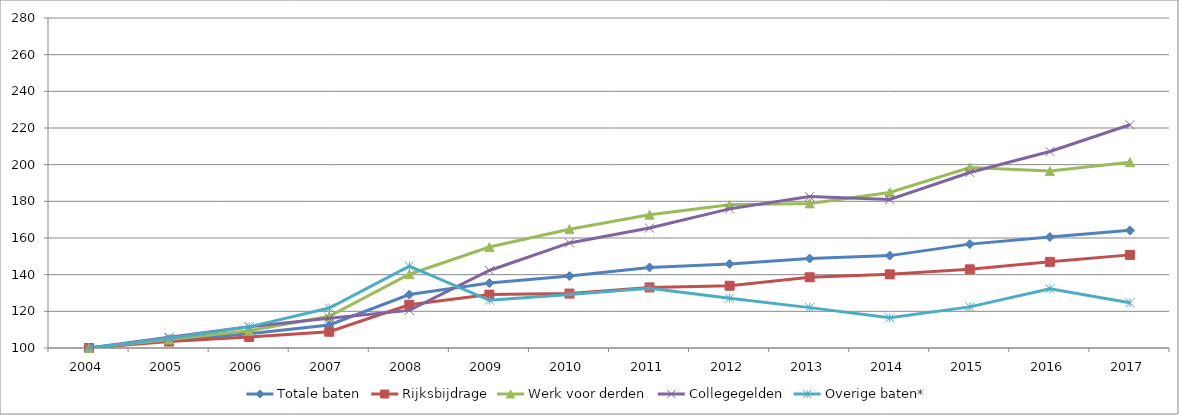
| Category | Totale baten | Rijksbijdrage | Werk voor derden | Collegegelden | Overige baten* |
|---|---|---|---|---|---|
| 2004.0 | 100 | 100 | 100 | 100 | 100 |
| 2005.0 | 104.092 | 103.499 | 104.629 | 105.881 | 105.274 |
| 2006.0 | 107.725 | 106.046 | 109.4 | 111.65 | 111.532 |
| 2007.0 | 112.54 | 108.881 | 117.297 | 116.238 | 121.792 |
| 2008.0 | 129.159 | 123.607 | 140.241 | 120.507 | 144.7 |
| 2009.0 | 135.394 | 129.117 | 155.052 | 142.268 | 126.04 |
| 2010.0 | 139.236 | 129.673 | 164.812 | 157.305 | 129.194 |
| 2011.0 | 143.936 | 133.048 | 172.718 | 165.412 | 132.613 |
| 2012.0 | 145.837 | 133.95 | 178.088 | 175.878 | 127.131 |
| 2013.0 | 148.786 | 138.576 | 178.882 | 182.576 | 122.028 |
| 2014.0 | 150.389 | 140.17 | 184.857 | 180.975 | 116.442 |
| 2015.0 | 156.657 | 142.9 | 198.435 | 195.707 | 122.426 |
| 2016.0 | 160.529 | 146.987 | 196.5 | 207.207 | 132.276 |
| 2017.0 | 164.164 | 150.797 | 201.356 | 221.776 | 124.656 |